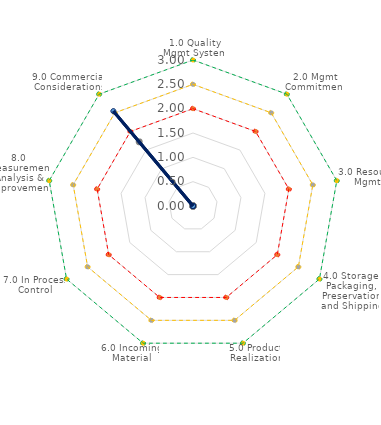
| Category | Red | Yellow | Green | Supplier  Score | Sullair  Score |
|---|---|---|---|---|---|
| 1.0 Quality Mgmt System | 2 | 2.5 | 3 | 0 | 0 |
| 2.0 Mgmt Commitment | 2 | 2.5 | 3 | 0 | 0 |
| 3.0 Resource Mgmt | 2 | 2.5 | 3 | 0 | 0 |
| 4.0 Storage, Packaging, Preservation and Shipping | 2 | 2.5 | 3 | 0 | 0 |
| 5.0 Product Realization | 2 | 2.5 | 3 | 0 | 0 |
| 6.0 Incoming Material | 2 | 2.5 | 3 | 0 | 0 |
| 7.0 In Process Control | 2 | 2.5 | 3 | 0 | 0 |
| 8.0 Measurement Analysis & Improvement | 2 | 2.5 | 3 | 0 | 0 |
| 9.0 Commercial Considerations | 2 | 2.5 | 3 | 1.72 | 2.545 |